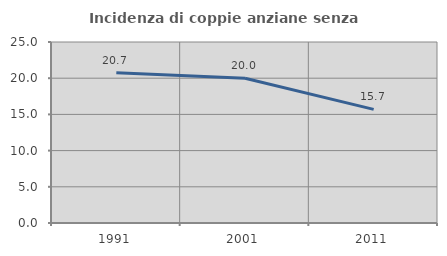
| Category | Incidenza di coppie anziane senza figli  |
|---|---|
| 1991.0 | 20.737 |
| 2001.0 | 20 |
| 2011.0 | 15.695 |